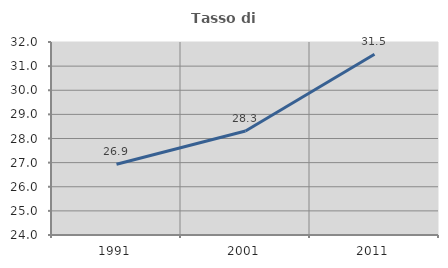
| Category | Tasso di occupazione   |
|---|---|
| 1991.0 | 26.931 |
| 2001.0 | 28.312 |
| 2011.0 | 31.492 |